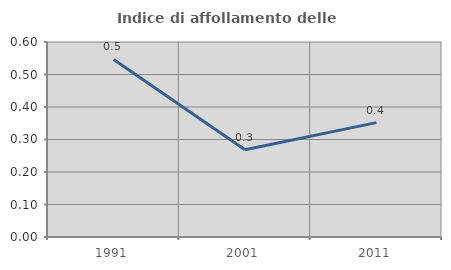
| Category | Indice di affollamento delle abitazioni  |
|---|---|
| 1991.0 | 0.546 |
| 2001.0 | 0.268 |
| 2011.0 | 0.352 |